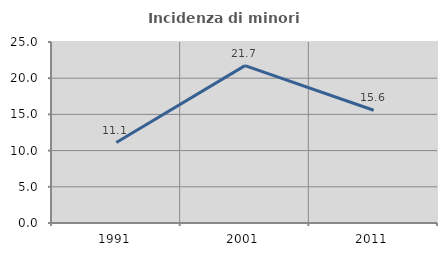
| Category | Incidenza di minori stranieri |
|---|---|
| 1991.0 | 11.111 |
| 2001.0 | 21.739 |
| 2011.0 | 15.574 |